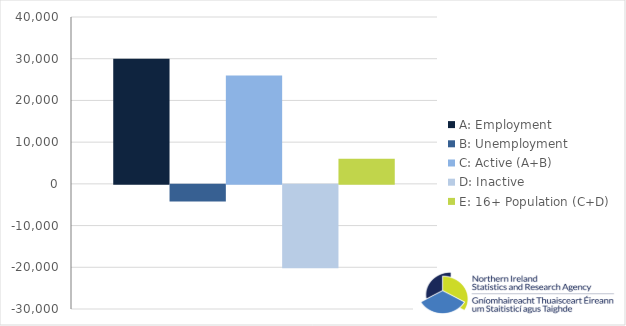
| Category | A: Employment | B: Unemployment | C: Active (A+B) | D: Inactive | E: 16+ Population (C+D) |
|---|---|---|---|---|---|
| 0 | 30000 | -4000 | 26000 | -20000 | 6000 |